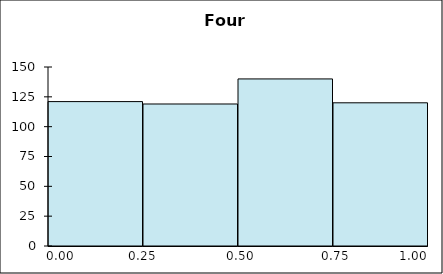
| Category | Series 1 |
|---|---|
| 0 | 121 |
| 1 | 119 |
| 2 | 140 |
| 3 | 120 |